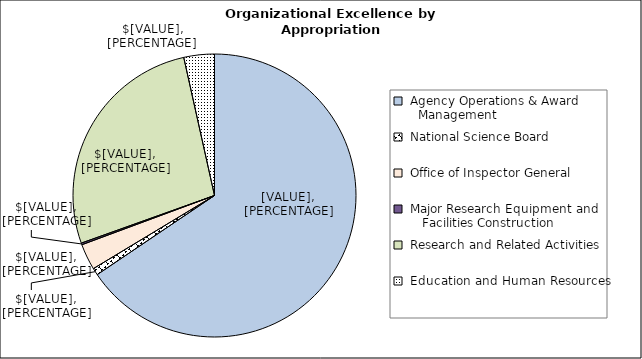
| Category |  Organizational Excellence by Appropriation  |
|---|---|
|  Agency Operations & Award
   Management  | 336.89 |
|  National Science Board  | 4.1 |
|  Office of Inspector General  | 15.35 |
|  Major Research Equipment and 
    Facilities Construction  | 1 |
|  Research and Related Activities  | 138.62 |
|  Education and Human Resources  | 17.94 |